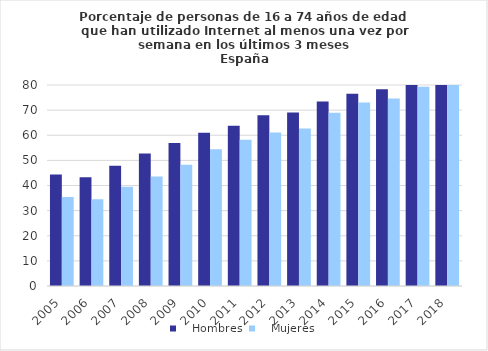
| Category |    Hombres |    Mujeres |
|---|---|---|
| 2005.0 | 44.351 | 35.402 |
| 2006.0 | 43.3 | 34.5 |
| 2007.0 | 47.9 | 39.5 |
| 2008.0 | 52.7 | 43.6 |
| 2009.0 | 56.9 | 48.3 |
| 2010.0 | 61 | 54.4 |
| 2011.0 | 63.8 | 58.2 |
| 2012.0 | 68 | 61.1 |
| 2013.0 | 69.1 | 62.7 |
| 2014.0 | 73.4 | 69 |
| 2015.0 | 76.5 | 73 |
| 2016.0 | 78.3 | 74.6 |
| 2017.0 | 80.8 | 79.3 |
| 2018.0 | 83 | 82 |